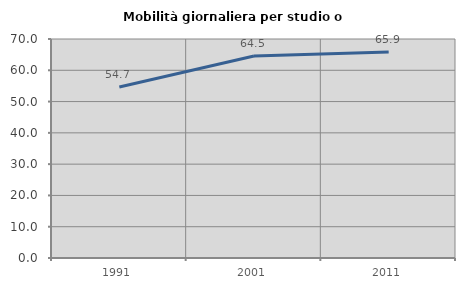
| Category | Mobilità giornaliera per studio o lavoro |
|---|---|
| 1991.0 | 54.668 |
| 2001.0 | 64.541 |
| 2011.0 | 65.882 |